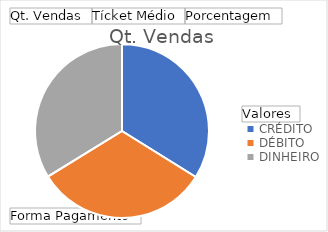
| Category | Qt. Vendas | Tícket Médio | Porcentagem |
|---|---|---|---|
| CRÉDITO | 339 | 245.183 | 0.328 |
| DÉBITO | 324 | 251.398 | 0.322 |
| DINHEIRO | 338 | 262.065 | 0.35 |